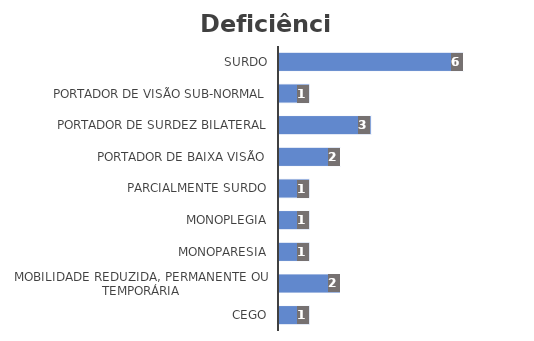
| Category | Series 0 |
|---|---|
| Cego | 1 |
| Mobilidade reduzida, permanente ou temporária | 2 |
| Monoparesia | 1 |
| Monoplegia | 1 |
| Parcialmente surdo | 1 |
| Portador de baixa visão | 2 |
| Portador de surdez bilateral | 3 |
| Portador de visão sub-normal | 1 |
| Surdo | 6 |